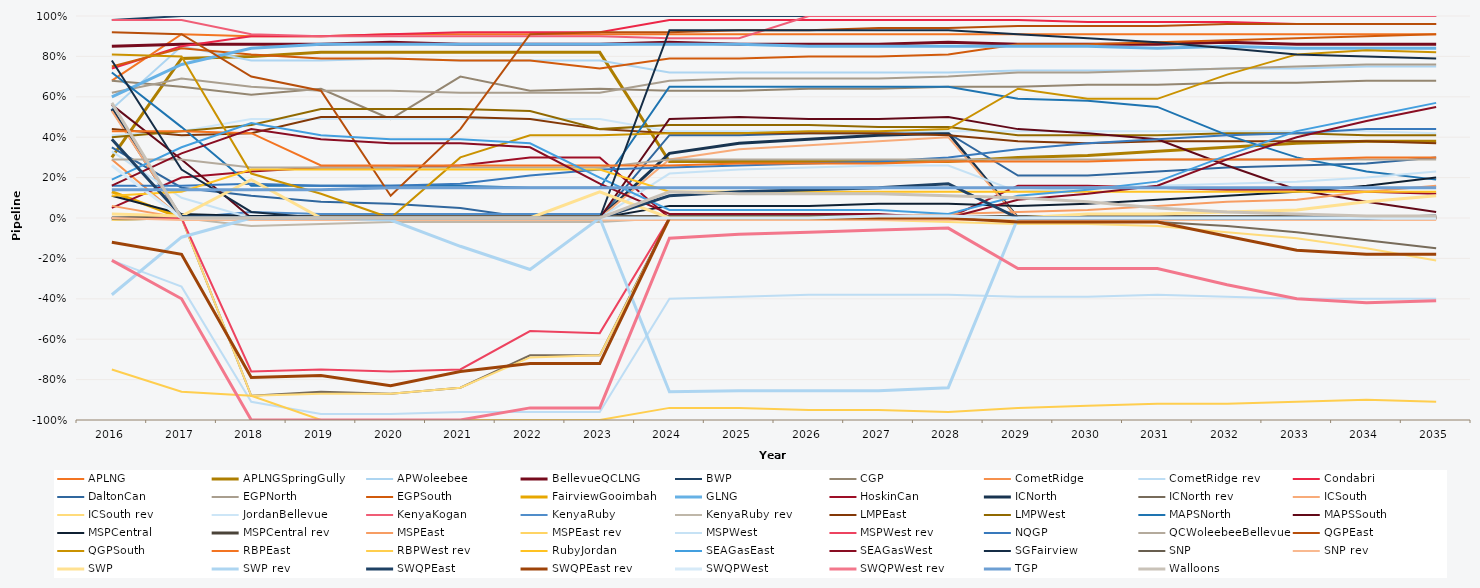
| Category | APLNG | APLNGSpringGully | APWoleebee | BellevueQCLNG | BWP | CGP | CometRidge | CometRidge rev | Condabri | DaltonCan | EGPNorth | EGPSouth | FairviewGooimbah | GLNG | HoskinCan | ICNorth | ICNorth rev | ICSouth | ICSouth rev | JordanBellevue | KenyaKogan | KenyaRuby | KenyaRuby rev | LMPEast | LMPWest | MAPSNorth | MAPSSouth | MSPCentral | MSPCentral rev | MSPEast | MSPEast rev | MSPWest | MSPWest rev | NQGP | QCWoleebeeBellevue | QGPEast | QGPSouth | RBPEast | RBPWest rev | RubyJordan | SEAGasEast | SEAGasWest | SGFairview | SNP | SNP rev | SWP | SWP rev | SWQPEast | SWQPEast rev | SWQPWest | SWQPWest rev | TGP | Walloons |
|---|---|---|---|---|---|---|---|---|---|---|---|---|---|---|---|---|---|---|---|---|---|---|---|---|---|---|---|---|---|---|---|---|---|---|---|---|---|---|---|---|---|---|---|---|---|---|---|---|---|---|---|---|---|
| 2016.0 | 0.68 | 0.3 | 0.54 | 0.85 | 0.98 | 0.68 | 0.29 | -0.21 | 0.74 | 0.35 | 0.62 | 0.75 | 0.13 | 0.6 | 0.05 | 0.54 | -0.01 | 0.53 | -0.01 | 0.41 | 0.98 | 0 | 0 | 0.44 | 0.4 | 0.72 | 0.56 | 0.11 | 0 | 0.06 | 0 | 0.33 | 0 | 0.16 | 0.29 | 0.92 | 0.81 | 0.43 | -0.75 | 0.11 | 0.19 | 0.16 | 0.78 | 0 | 0 | 0.02 | -0.38 | 0.39 | -0.12 | 0.26 | -0.21 | 0.14 | 0.57 |
| 2017.0 | 0.91 | 0.79 | 0.85 | 0.86 | 1 | 0.65 | 0 | -0.34 | 0.85 | 0.15 | 0.69 | 0.84 | 0 | 0.76 | 0.2 | 0 | 0 | 0 | 0 | 0.43 | 0.98 | 0 | 0 | 0.41 | 0.43 | 0.45 | 0.29 | 0.02 | 0 | 0 | 0 | 0.1 | 0 | 0.16 | 0.29 | 0.91 | 0.8 | 0.43 | -0.86 | 0.13 | 0.35 | 0.32 | 0.24 | 0.01 | -0.01 | 0.01 | -0.095 | 0.01 | -0.18 | 0 | -0.4 | 0.14 | 0 |
| 2018.0 | 0.9 | 0.8 | 0.78 | 0.86 | 1 | 0.61 | 0 | -0.91 | 0.9 | 0.11 | 0.65 | 0.81 | 0 | 0.84 | 0.23 | 0 | -0.88 | 0 | -0.88 | 0.49 | 0.91 | 0.03 | -0.04 | 0.42 | 0.46 | 0.16 | 0 | 0.01 | 0 | 0 | 0 | 0 | -0.76 | 0.17 | 0.25 | 0.7 | 0.22 | 0.42 | -0.88 | 0.24 | 0.47 | 0.44 | 0.03 | 0 | -0.01 | 0.19 | 0 | 0 | -0.79 | 0 | -1 | 0.14 | 0 |
| 2019.0 | 0.9 | 0.82 | 0.78 | 0.86 | 1 | 0.64 | 0 | -0.97 | 0.9 | 0.08 | 0.63 | 0.79 | 0 | 0.86 | 0.25 | 0 | -0.86 | 0 | -0.87 | 0.49 | 0.9 | 0.02 | -0.03 | 0.5 | 0.54 | 0.16 | 0 | 0.01 | 0 | 0 | 0 | 0 | -0.75 | 0.16 | 0.25 | 0.63 | 0.12 | 0.26 | -1 | 0.24 | 0.41 | 0.39 | 0 | 0.01 | -0.01 | 0 | 0 | 0 | -0.78 | 0 | -1 | 0.14 | 0 |
| 2020.0 | 0.91 | 0.82 | 0.79 | 0.87 | 1 | 0.49 | 0 | -0.97 | 0.91 | 0.07 | 0.63 | 0.79 | 0 | 0.86 | 0.25 | 0 | -0.87 | 0 | -0.87 | 0.49 | 0.9 | 0.02 | -0.02 | 0.5 | 0.54 | 0.16 | 0 | 0.01 | 0 | 0 | 0 | 0 | -0.76 | 0.16 | 0.25 | 0.11 | 0 | 0.26 | -1 | 0.24 | 0.39 | 0.37 | 0 | 0.01 | -0.01 | 0 | -0.01 | 0 | -0.83 | 0 | -1 | 0.15 | 0 |
| 2021.0 | 0.91 | 0.82 | 0.78 | 0.86 | 1 | 0.7 | 0 | -0.96 | 0.92 | 0.05 | 0.62 | 0.78 | 0 | 0.86 | 0.26 | 0 | -0.84 | 0 | -0.84 | 0.49 | 0.9 | 0.02 | -0.02 | 0.5 | 0.54 | 0.16 | 0 | 0.01 | 0 | 0 | 0 | 0 | -0.75 | 0.17 | 0.25 | 0.44 | 0.3 | 0.26 | -1 | 0.24 | 0.39 | 0.37 | 0 | 0.01 | -0.01 | 0 | -0.14 | 0 | -0.76 | 0 | -1 | 0.15 | 0 |
| 2022.0 | 0.91 | 0.82 | 0.78 | 0.86 | 1 | 0.63 | 0 | -0.96 | 0.92 | 0 | 0.62 | 0.78 | 0 | 0.86 | 0.3 | 0 | -0.68 | 0 | -0.69 | 0.49 | 0.9 | 0.02 | -0.02 | 0.49 | 0.53 | 0.15 | 0 | 0 | 0 | 0 | 0 | 0 | -0.56 | 0.21 | 0.25 | 0.91 | 0.41 | 0.26 | -1 | 0.24 | 0.37 | 0.35 | 0 | 0.01 | -0.01 | 0 | -0.255 | 0 | -0.72 | 0 | -0.94 | 0.15 | 0 |
| 2023.0 | 0.91 | 0.82 | 0.78 | 0.86 | 1 | 0.64 | 0 | -0.96 | 0.92 | 0 | 0.62 | 0.74 | 0 | 0.86 | 0.3 | 0 | -0.68 | 0 | -0.68 | 0.49 | 0.9 | 0.02 | -0.02 | 0.44 | 0.44 | 0.15 | 0 | 0 | 0 | 0 | 0 | 0 | -0.57 | 0.24 | 0.25 | 0.92 | 0.41 | 0.26 | -1 | 0.24 | 0.2 | 0.17 | 0 | 0.01 | -0.01 | 0.13 | 0 | 0 | -0.72 | 0 | -0.94 | 0.15 | 0 |
| 2024.0 | 0.91 | 0.28 | 0.72 | 0.87 | 1 | 0.63 | 0 | -0.4 | 0.98 | 0.41 | 0.68 | 0.79 | 0 | 0.86 | 0 | 0.32 | 0 | 0.29 | -0.01 | 0.43 | 0.89 | 0 | 0 | 0.42 | 0.46 | 0.65 | 0.49 | 0.06 | 0 | 0.01 | 0 | 0.22 | 0 | 0.25 | 0.29 | 0.92 | 0.42 | 0.26 | -0.94 | 0.13 | 0.04 | 0.02 | 0.93 | 0.01 | -0.01 | 0 | -0.86 | 0.11 | 0 | 0 | -0.1 | 0.15 | 0.13 |
| 2025.0 | 0.91 | 0.28 | 0.72 | 0.86 | 1 | 0.63 | 0 | -0.39 | 0.98 | 0.41 | 0.69 | 0.79 | 0 | 0.86 | 0 | 0.37 | 0 | 0.34 | -0.01 | 0.43 | 0.89 | 0 | 0 | 0.42 | 0.46 | 0.65 | 0.5 | 0.06 | 0 | 0.01 | 0 | 0.24 | 0 | 0.26 | 0.29 | 0.93 | 0.42 | 0.27 | -0.94 | 0.13 | 0.04 | 0.02 | 0.93 | 0.01 | -0.01 | 0 | -0.855 | 0.13 | 0 | 0 | -0.08 | 0.15 | 0.12 |
| 2026.0 | 0.91 | 0.28 | 0.72 | 0.86 | 1 | 0.64 | 0 | -0.38 | 0.98 | 0.42 | 0.69 | 0.8 | 0 | 0.85 | 0 | 0.39 | 0 | 0.36 | -0.01 | 0.43 | 1 | 0 | 0 | 0.42 | 0.46 | 0.65 | 0.49 | 0.06 | 0 | 0.01 | 0 | 0.25 | 0 | 0.27 | 0.29 | 0.93 | 0.43 | 0.27 | -0.95 | 0.13 | 0.04 | 0.02 | 0.93 | 0.01 | -0.01 | 0 | -0.855 | 0.14 | 0 | 0 | -0.07 | 0.15 | 0.12 |
| 2027.0 | 0.91 | 0.28 | 0.72 | 0.86 | 1 | 0.64 | 0 | -0.38 | 0.98 | 0.42 | 0.69 | 0.8 | 0 | 0.85 | 0 | 0.41 | 0 | 0.38 | -0.01 | 0.43 | 1 | 0 | 0 | 0.42 | 0.45 | 0.65 | 0.49 | 0.07 | 0 | 0.01 | 0 | 0.26 | 0 | 0.28 | 0.29 | 0.94 | 0.43 | 0.27 | -0.95 | 0.13 | 0.04 | 0.02 | 0.93 | 0.01 | -0.01 | 0 | -0.855 | 0.15 | 0 | 0.01 | -0.06 | 0.15 | 0.12 |
| 2028.0 | 0.91 | 0.28 | 0.72 | 0.87 | 1 | 0.65 | 0 | -0.38 | 0.98 | 0.42 | 0.7 | 0.81 | 0 | 0.85 | 0 | 0.42 | 0 | 0.4 | -0.02 | 0.43 | 1 | 0 | 0 | 0.41 | 0.45 | 0.65 | 0.5 | 0.07 | 0 | 0.02 | 0 | 0.26 | 0 | 0.3 | 0.29 | 0.94 | 0.44 | 0.28 | -0.96 | 0.13 | 0.02 | 0 | 0.93 | 0.01 | -0.01 | 0 | -0.84 | 0.17 | 0 | 0.01 | -0.05 | 0.15 | 0.11 |
| 2029.0 | 0.91 | 0.3 | 0.73 | 0.86 | 1 | 0.65 | 0 | -0.39 | 0.98 | 0.21 | 0.72 | 0.86 | 0 | 0.85 | 0.16 | 0 | 0 | 0 | -0.03 | 0.43 | 1 | 0 | 0 | 0.38 | 0.41 | 0.59 | 0.44 | 0.06 | 0 | 0.03 | 0 | 0.13 | 0 | 0.34 | 0.29 | 0.95 | 0.64 | 0.28 | -0.94 | 0.13 | 0.11 | 0.09 | 0.91 | 0.01 | -0.01 | 0 | 0 | 0 | -0.02 | 0 | -0.25 | 0.15 | 0.1 |
| 2030.0 | 0.91 | 0.31 | 0.73 | 0.86 | 1 | 0.66 | 0 | -0.39 | 0.97 | 0.21 | 0.72 | 0.86 | 0 | 0.85 | 0.16 | 0 | 0 | 0 | -0.03 | 0.43 | 1 | 0 | 0 | 0.37 | 0.41 | 0.58 | 0.42 | 0.07 | 0 | 0.04 | 0 | 0.15 | 0 | 0.37 | 0.29 | 0.95 | 0.59 | 0.28 | -0.93 | 0.13 | 0.14 | 0.12 | 0.89 | 0.01 | -0.01 | 0.02 | 0 | 0 | -0.02 | 0 | -0.25 | 0.15 | 0.08 |
| 2031.0 | 0.91 | 0.33 | 0.73 | 0.86 | 1 | 0.66 | 0 | -0.38 | 0.97 | 0.23 | 0.73 | 0.87 | 0 | 0.84 | 0.15 | 0 | -0.02 | 0 | -0.04 | 0.43 | 1 | 0 | 0 | 0.38 | 0.41 | 0.55 | 0.39 | 0.09 | 0 | 0.06 | 0 | 0.16 | 0 | 0.39 | 0.29 | 0.95 | 0.59 | 0.29 | -0.92 | 0.13 | 0.18 | 0.16 | 0.87 | 0.01 | -0.01 | 0.02 | 0 | 0 | -0.02 | 0 | -0.25 | 0.15 | 0.05 |
| 2032.0 | 0.91 | 0.35 | 0.74 | 0.87 | 1 | 0.67 | 0 | -0.39 | 0.97 | 0.25 | 0.74 | 0.88 | 0 | 0.85 | 0.14 | 0 | -0.04 | 0 | -0.07 | 0.43 | 1 | 0 | 0 | 0.38 | 0.42 | 0.41 | 0.26 | 0.11 | 0 | 0.08 | 0 | 0.17 | 0 | 0.41 | 0.29 | 0.96 | 0.71 | 0.29 | -0.92 | 0.13 | 0.31 | 0.29 | 0.84 | 0.01 | -0.01 | 0.03 | 0 | 0 | -0.09 | 0 | -0.33 | 0.15 | 0.03 |
| 2033.0 | 0.91 | 0.37 | 0.74 | 0.86 | 1 | 0.67 | 0 | -0.4 | 0.96 | 0.26 | 0.75 | 0.89 | 0 | 0.84 | 0.14 | 0 | -0.07 | 0 | -0.1 | 0.43 | 1 | 0 | 0 | 0.38 | 0.42 | 0.3 | 0.14 | 0.13 | 0 | 0.09 | 0 | 0.18 | 0 | 0.42 | 0.29 | 0.96 | 0.81 | 0.29 | -0.91 | 0.13 | 0.43 | 0.4 | 0.81 | 0.01 | -0.01 | 0.04 | 0 | 0 | -0.16 | 0 | -0.4 | 0.15 | 0.02 |
| 2034.0 | 0.91 | 0.38 | 0.75 | 0.86 | 1 | 0.68 | 0 | -0.4 | 0.96 | 0.27 | 0.76 | 0.9 | 0 | 0.84 | 0.13 | 0 | -0.11 | 0 | -0.15 | 0.43 | 1 | 0 | 0 | 0.38 | 0.41 | 0.23 | 0.08 | 0.16 | 0 | 0.13 | 0 | 0.2 | 0 | 0.44 | 0.29 | 0.96 | 0.83 | 0.3 | -0.9 | 0.13 | 0.5 | 0.48 | 0.8 | 0.01 | -0.01 | 0.08 | 0 | 0 | -0.18 | 0 | -0.42 | 0.15 | 0.01 |
| 2035.0 | 0.91 | 0.38 | 0.75 | 0.86 | 1 | 0.68 | 0 | -0.4 | 0.96 | 0.3 | 0.76 | 0.91 | 0 | 0.84 | 0.12 | 0 | -0.15 | 0 | -0.21 | 0.42 | 1 | 0 | 0 | 0.37 | 0.41 | 0.19 | 0.03 | 0.2 | 0 | 0.16 | 0 | 0.23 | 0 | 0.44 | 0.29 | 0.96 | 0.82 | 0.3 | -0.91 | 0.13 | 0.57 | 0.55 | 0.79 | 0.01 | -0.01 | 0.11 | 0 | 0.01 | -0.18 | 0 | -0.41 | 0.15 | 0.01 |